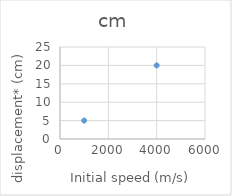
| Category | cm |
|---|---|
| 1000.0 | 5 |
| 4000.0 | 20 |